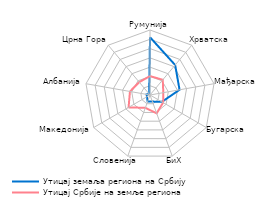
| Category | Утицај земаља региона на Србију | Утицај Србије на земље региона |
|---|---|---|
| Румунија | 0.311 | 0.102 |
| Хрватска | 0.211 | 0.107 |
| Мађарска | 0.162 | 0.073 |
| Бугарска | 0.074 | 0.082 |
| БиХ | 0.038 | 0.105 |
| Словенија | 0.037 | 0.073 |
| Македонија | 0.019 | 0.133 |
| Албанија | 0.019 | 0.11 |
| Црна Гора | 0.007 | 0.09 |